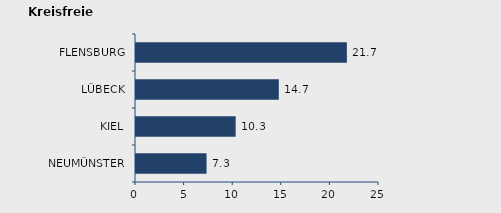
| Category | Wanderungssaldo |
|---|---|
| NEUMÜNSTER | 7.258 |
| KIEL | 10.254 |
| LÜBECK | 14.691 |
| FLENSBURG | 21.696 |